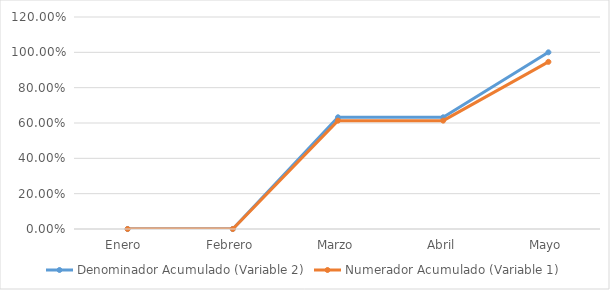
| Category | Denominador Acumulado (Variable 2) | Numerador Acumulado (Variable 1) |
|---|---|---|
| Enero  | 0 | 0 |
| Febrero | 0 | 0 |
| Marzo | 0.632 | 0.613 |
| Abril | 0.632 | 0.613 |
| Mayo | 1 | 0.946 |